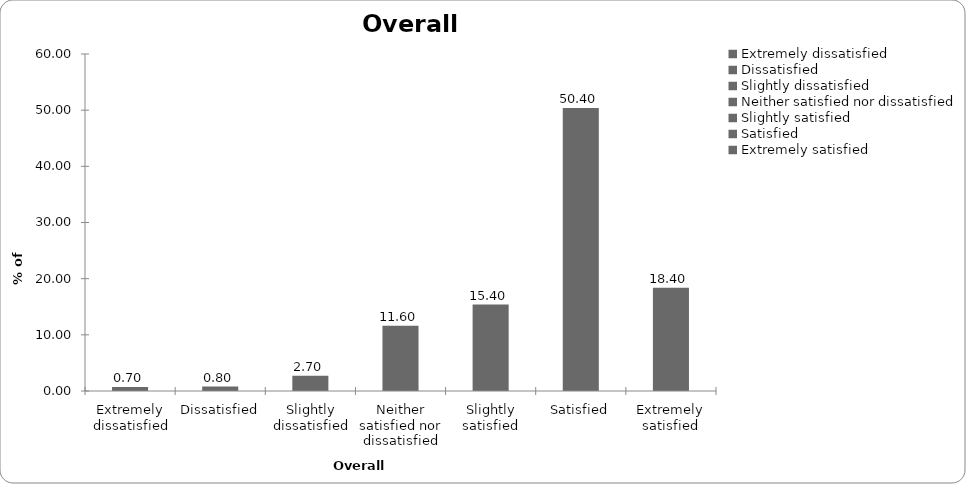
| Category | Overall satisfaction |
|---|---|
| Extremely dissatisfied | 0.7 |
| Dissatisfied | 0.8 |
| Slightly dissatisfied | 2.7 |
| Neither satisfied nor dissatisfied | 11.6 |
| Slightly satisfied | 15.4 |
| Satisfied | 50.4 |
| Extremely satisfied | 18.4 |